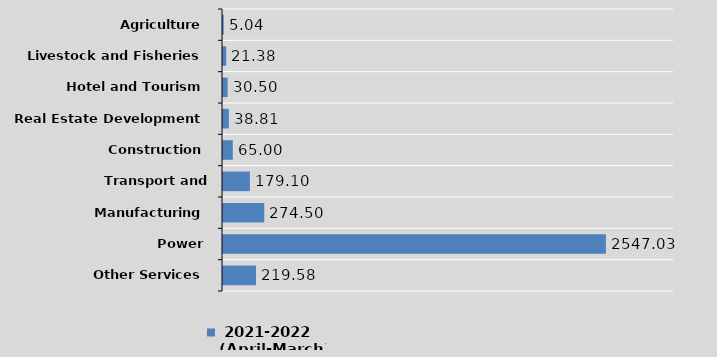
| Category |  2021-2022
(April-March) |
|---|---|
| Other Services | 219.58 |
| Power | 2547.03 |
| Manufacturing | 274.5 |
| Transport and Communication | 179.1 |
| Construction | 65 |
| Real Estate Development | 38.81 |
| Hotel and Tourism | 30.5 |
| Livestock and Fisheries | 21.38 |
| Agriculture | 5.04 |